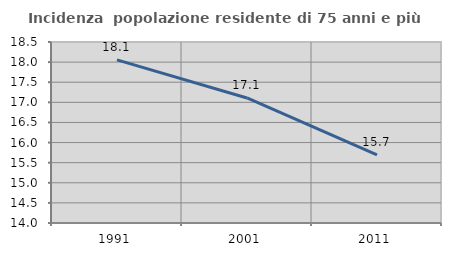
| Category | Incidenza  popolazione residente di 75 anni e più |
|---|---|
| 1991.0 | 18.056 |
| 2001.0 | 17.109 |
| 2011.0 | 15.692 |